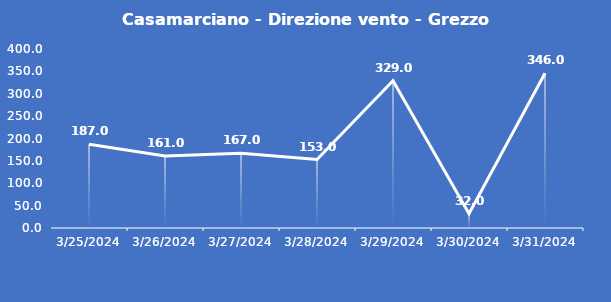
| Category | Casamarciano - Direzione vento - Grezzo (°N) |
|---|---|
| 3/25/24 | 187 |
| 3/26/24 | 161 |
| 3/27/24 | 167 |
| 3/28/24 | 153 |
| 3/29/24 | 329 |
| 3/30/24 | 32 |
| 3/31/24 | 346 |